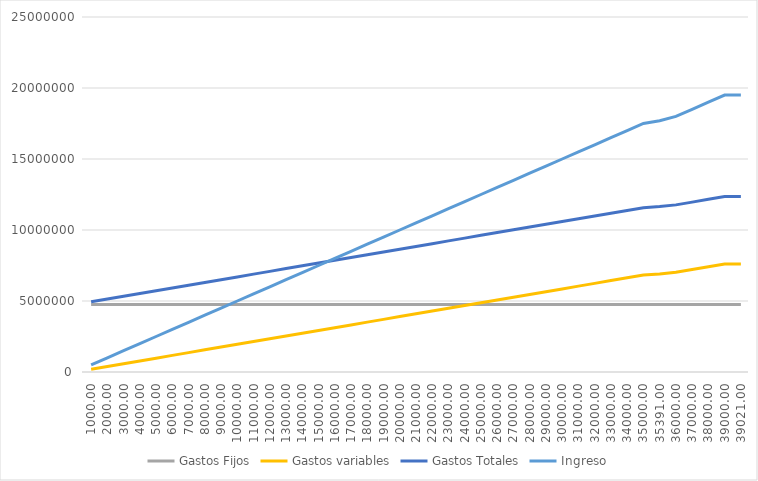
| Category | Gastos Fijos | Gastos variables | Gastos Totales | Ingreso |
|---|---|---|---|---|
| 1000.0 | 4746315.662 | 195074.171 | 4941389.833 | 500000 |
| 2000.0 | 4746315.662 | 390148.342 | 5136464.004 | 1000000 |
| 3000.0 | 4746315.662 | 585222.513 | 5331538.175 | 1500000 |
| 4000.0 | 4746315.662 | 780296.685 | 5526612.346 | 2000000 |
| 5000.0 | 4746315.662 | 975370.856 | 5721686.517 | 2500000 |
| 6000.0 | 4746315.662 | 1170445.027 | 5916760.688 | 3000000 |
| 7000.0 | 4746315.662 | 1365519.198 | 6111834.86 | 3500000 |
| 8000.0 | 4746315.662 | 1560593.369 | 6306909.031 | 4000000 |
| 9000.0 | 4746315.662 | 1755667.54 | 6501983.202 | 4500000 |
| 10000.0 | 4746315.662 | 1950741.711 | 6697057.373 | 5000000 |
| 11000.0 | 4746315.662 | 2145815.883 | 6892131.544 | 5500000 |
| 12000.0 | 4746315.662 | 2340890.054 | 7087205.715 | 6000000 |
| 13000.0 | 4746315.662 | 2535964.225 | 7282279.886 | 6500000 |
| 14000.0 | 4746315.662 | 2731038.396 | 7477354.057 | 7000000 |
| 15000.0 | 4746315.662 | 2926112.567 | 7672428.229 | 7500000 |
| 16000.0 | 4746315.662 | 3121186.738 | 7867502.4 | 8000000 |
| 17000.0 | 4746315.662 | 3316260.909 | 8062576.571 | 8500000 |
| 18000.0 | 4746315.662 | 3511335.08 | 8257650.742 | 9000000 |
| 19000.0 | 4746315.662 | 3706409.252 | 8452724.913 | 9500000 |
| 20000.0 | 4746315.662 | 3901483.423 | 8647799.084 | 10000000 |
| 21000.0 | 4746315.662 | 4096557.594 | 8842873.255 | 10500000 |
| 22000.0 | 4746315.662 | 4291631.765 | 9037947.427 | 11000000 |
| 23000.0 | 4746315.662 | 4486705.936 | 9233021.598 | 11500000 |
| 24000.0 | 4746315.662 | 4681780.107 | 9428095.769 | 12000000 |
| 25000.0 | 4746315.662 | 4876854.278 | 9623169.94 | 12500000 |
| 26000.0 | 4746315.662 | 5071928.45 | 9818244.111 | 13000000 |
| 27000.0 | 4746315.662 | 5267002.621 | 10013318.282 | 13500000 |
| 28000.0 | 4746315.662 | 5462076.792 | 10208392.453 | 14000000 |
| 29000.0 | 4746315.662 | 5657150.963 | 10403466.625 | 14500000 |
| 30000.0 | 4746315.662 | 5852225.134 | 10598540.796 | 15000000 |
| 31000.0 | 4746315.662 | 6047299.305 | 10793614.967 | 15500000 |
| 32000.0 | 4746315.662 | 6242373.476 | 10988689.138 | 16000000 |
| 33000.0 | 4746315.662 | 6437447.648 | 11183763.309 | 16500000 |
| 34000.0 | 4746315.662 | 6632521.819 | 11378837.48 | 17000000 |
| 35000.0 | 4746315.662 | 6827595.99 | 11573911.651 | 17500000 |
| 35391.0 | 4746315.662 | 6903869.991 | 11650185.652 | 17695500 |
| 36000.0 | 4746315.662 | 7022670.161 | 11768985.823 | 18000000 |
| 37000.0 | 4746315.662 | 7217744.332 | 11964059.994 | 18500000 |
| 38000.0 | 4746315.662 | 7412818.503 | 12159134.165 | 19000000 |
| 39000.0 | 4746315.662 | 7607892.674 | 12354208.336 | 19500000 |
| 39021.0 | 4746315.662 | 7611989.232 | 12358304.894 | 19510500 |